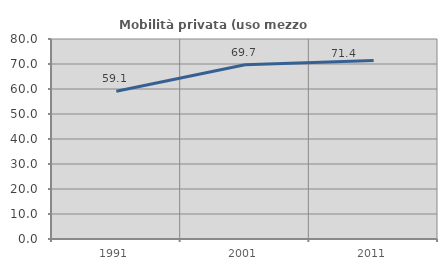
| Category | Mobilità privata (uso mezzo privato) |
|---|---|
| 1991.0 | 59.073 |
| 2001.0 | 69.693 |
| 2011.0 | 71.434 |